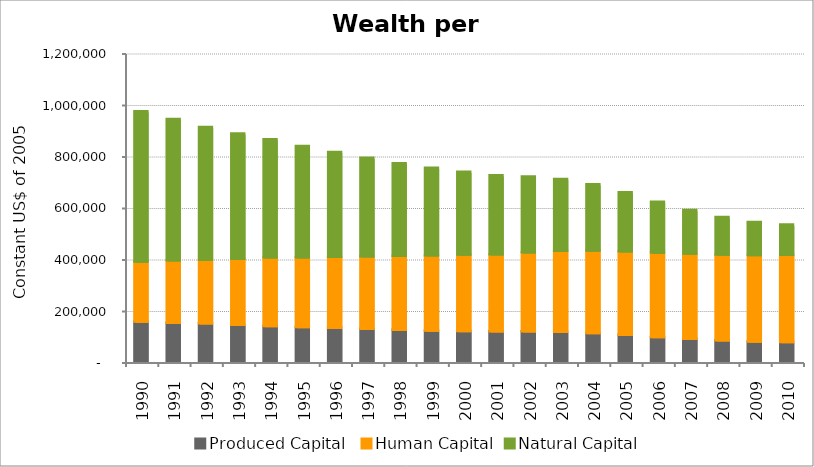
| Category | Produced Capital  | Human Capital | Natural Capital |
|---|---|---|---|
| 1990.0 | 155910.958 | 233553.341 | 583082.98 |
| 1991.0 | 151899.075 | 242616.404 | 547827.155 |
| 1992.0 | 149416.165 | 246745.855 | 515519.44 |
| 1993.0 | 143586.644 | 256651.2 | 485793.395 |
| 1994.0 | 139139.935 | 266649.294 | 458127.447 |
| 1995.0 | 135321.62 | 270297.441 | 432227.649 |
| 1996.0 | 131615.086 | 276153.012 | 407064.277 |
| 1997.0 | 128054.447 | 281917.199 | 382487.662 |
| 1998.0 | 124588.795 | 287233.836 | 359506.451 |
| 1999.0 | 121697.971 | 292144.028 | 339292.295 |
| 2000.0 | 119616.573 | 297030.545 | 321240.385 |
| 2001.0 | 118448.571 | 299467.738 | 306802.683 |
| 2002.0 | 118064.614 | 307341.826 | 294468.801 |
| 2003.0 | 116733.589 | 314172.33 | 279228.192 |
| 2004.0 | 112074.169 | 319847.874 | 257119.873 |
| 2005.0 | 104873.969 | 324281.138 | 228835.067 |
| 2006.0 | 96051.424 | 328005.132 | 197638.311 |
| 2007.0 | 89400.909 | 330934.935 | 168687.786 |
| 2008.0 | 83571.249 | 332798.659 | 145302.517 |
| 2009.0 | 78853.252 | 335673.117 | 128646.821 |
| 2010.0 | 77082.454 | 338355.863 | 117605.341 |